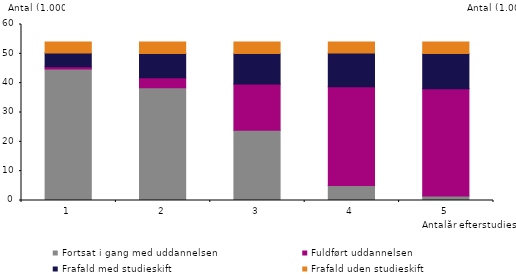
| Category | Fortsat i gang med uddannelsen | Fuldført uddannelsen | Frafald med studieskift | Frafald uden studieskift |
|---|---|---|---|---|
| 1.0 | 44871 | 739 | 4715 | 3680 |
| 2.0 | 38480 | 3341 | 8279 | 3905 |
| 3.0 | 23940 | 15776 | 10435 | 3854 |
| 4.0 | 5134 | 33668 | 11460 | 3743 |
| 5.0 | 1556 | 36522 | 12036 | 3891 |